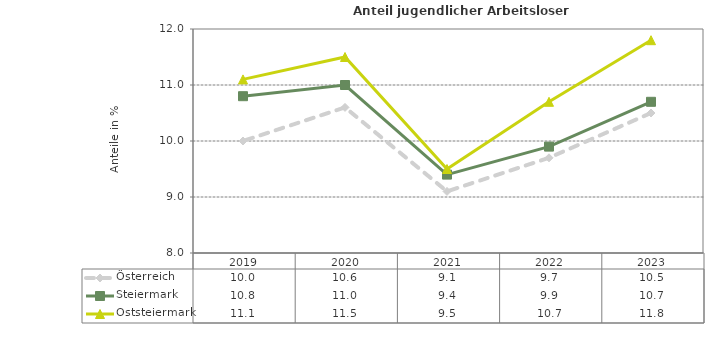
| Category | Österreich | Steiermark | Oststeiermark |
|---|---|---|---|
| 2023.0 | 10.5 | 10.7 | 11.8 |
| 2022.0 | 9.7 | 9.9 | 10.7 |
| 2021.0 | 9.1 | 9.4 | 9.5 |
| 2020.0 | 10.6 | 11 | 11.5 |
| 2019.0 | 10 | 10.8 | 11.1 |